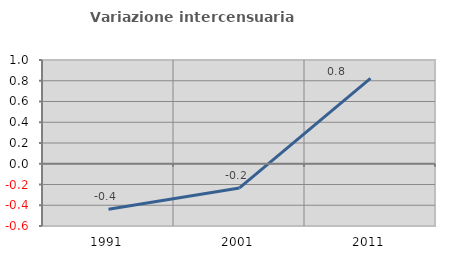
| Category | Variazione intercensuaria annua |
|---|---|
| 1991.0 | -0.438 |
| 2001.0 | -0.233 |
| 2011.0 | 0.823 |